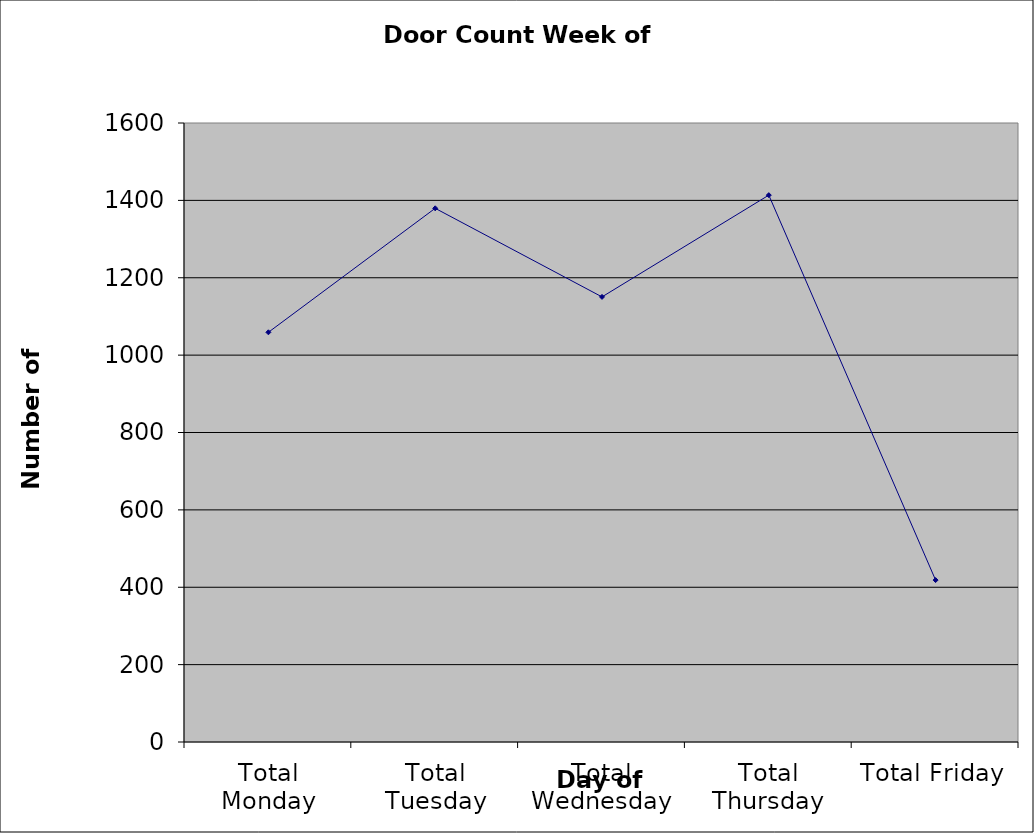
| Category | Series 0 |
|---|---|
| Total Monday | 1059 |
| Total Tuesday | 1379.5 |
| Total Wednesday | 1150.5 |
| Total Thursday | 1413.5 |
| Total Friday | 418.5 |